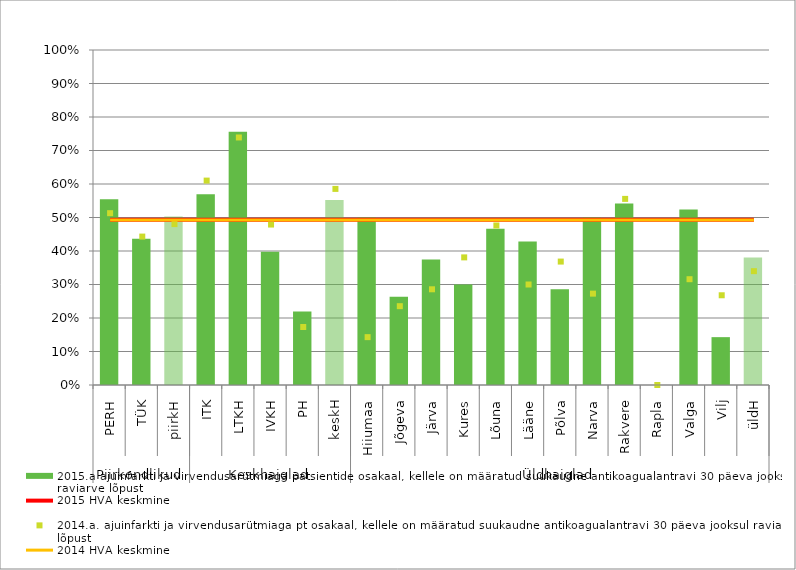
| Category | 2015.a ajuinfarkti ja virvendusarütmiaga patsientide osakaal, kellele on määratud suukaudne antikoagualantravi 30 päeva jooksul raviarve lõpust |
|---|---|
| 0 | 0.554 |
| 1 | 0.436 |
| 2 | 0.503 |
| 3 | 0.569 |
| 4 | 0.756 |
| 5 | 0.398 |
| 6 | 0.22 |
| 7 | 0.552 |
| 8 | 0.5 |
| 9 | 0.263 |
| 10 | 0.375 |
| 11 | 0.3 |
| 12 | 0.467 |
| 13 | 0.429 |
| 14 | 0.286 |
| 15 | 0.5 |
| 16 | 0.542 |
| 17 | 0 |
| 18 | 0.524 |
| 19 | 0.143 |
| 20 | 0.381 |